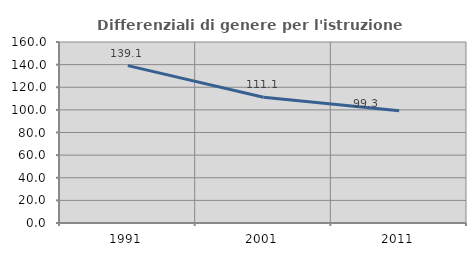
| Category | Differenziali di genere per l'istruzione superiore |
|---|---|
| 1991.0 | 139.106 |
| 2001.0 | 111.086 |
| 2011.0 | 99.288 |